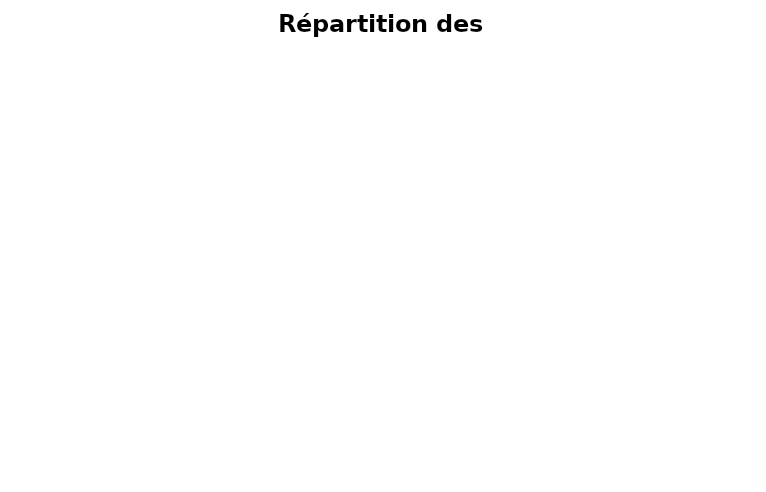
| Category | Series 0 |
|---|---|
|  Logement | 0 |
|  Ameublement et équipements | 0 |
|  Frais de scolarité | 0 |
|  Transports | 0 |
| Dépenses courantes | 0 |
|  Habillement | 0 |
|  Communication, culture et loisirs | 0 |
|  Santé et assurance | 0 |
|  Services financiers Crédit-Epargne | 0 |